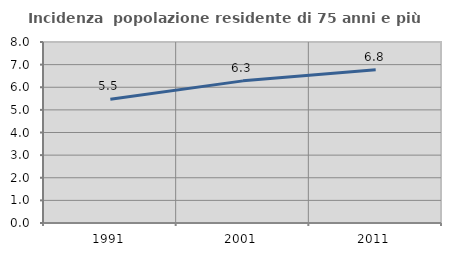
| Category | Incidenza  popolazione residente di 75 anni e più |
|---|---|
| 1991.0 | 5.472 |
| 2001.0 | 6.282 |
| 2011.0 | 6.772 |